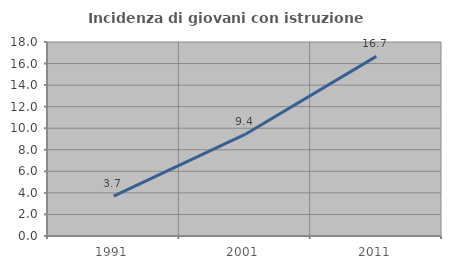
| Category | Incidenza di giovani con istruzione universitaria |
|---|---|
| 1991.0 | 3.704 |
| 2001.0 | 9.425 |
| 2011.0 | 16.667 |